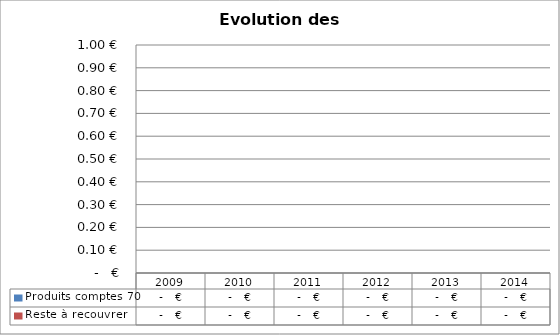
| Category | Produits comptes 70 | Reste à recouvrer |
|---|---|---|
| 2009.0 | 0 | 0 |
| 2010.0 | 0 | 0 |
| 2011.0 | 0 | 0 |
| 2012.0 | 0 | 0 |
| 2013.0 | 0 | 0 |
| 2014.0 | 0 | 0 |